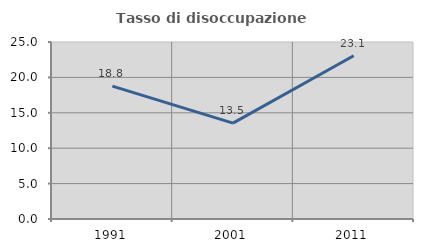
| Category | Tasso di disoccupazione giovanile  |
|---|---|
| 1991.0 | 18.77 |
| 2001.0 | 13.534 |
| 2011.0 | 23.053 |